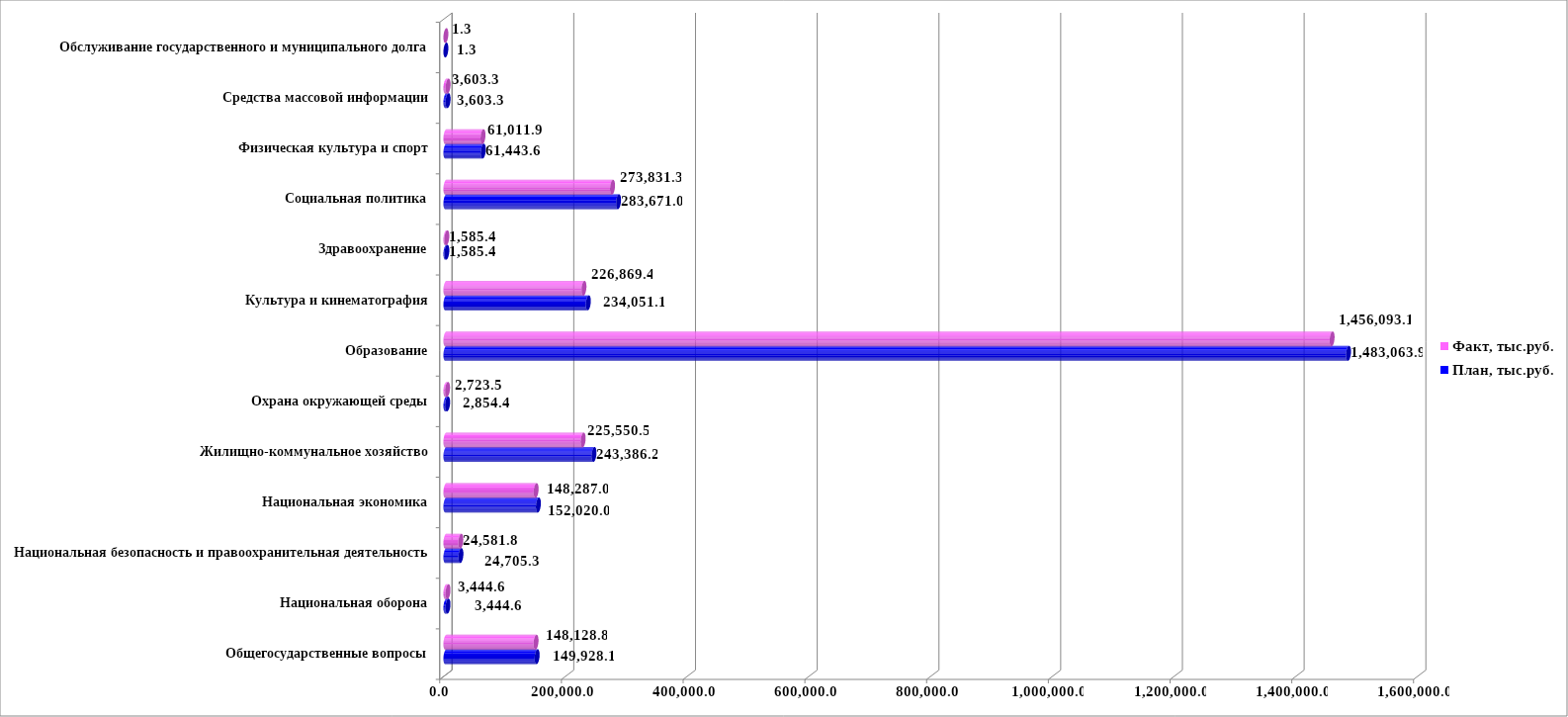
| Category | План, тыс.руб. | Факт, тыс.руб. |
|---|---|---|
| Общегосударственные вопросы | 149928.139 | 148128.8 |
| Национальная оборона | 3444.6 | 3444.6 |
| Национальная безопасность и правоохранительная деятельность | 24705.304 | 24581.8 |
| Национальная экономика | 152020.043 | 148287 |
| Жилищно-коммунальное хозяйство | 243386.216 | 225550.5 |
| Охрана окружающей среды | 2854.387 | 2723.5 |
| Образование | 1483063.861 | 1456093.1 |
| Культура и кинематография | 234051.116 | 226869.4 |
| Здравоохранение | 1585.383 | 1585.4 |
| Социальная политика | 283670.978 | 273831.3 |
| Физическая культура и спорт | 61443.57 | 61011.9 |
| Средства массовой информации | 3603.306 | 3603.3 |
| Обслуживание государственного и муниципального долга | 1.3 | 1.27 |